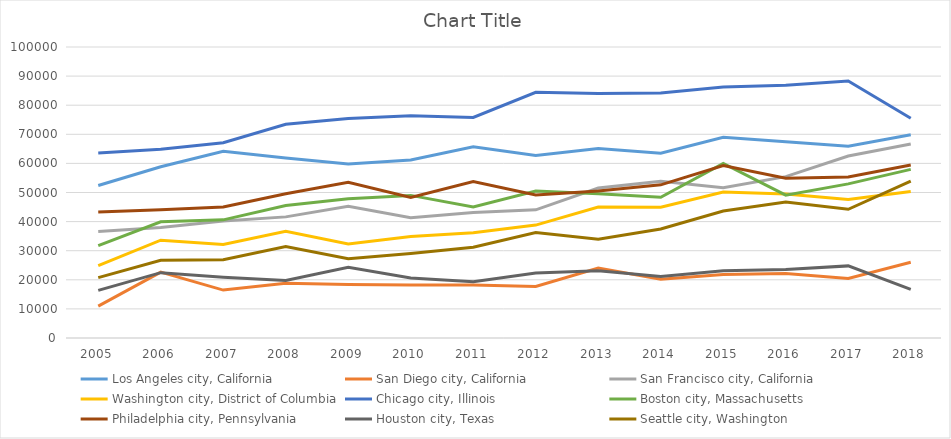
| Category | Los Angeles city, California | San Diego city, California | San Francisco city, California | Washington city, District of Columbia | Chicago city, Illinois | Boston city, Massachusetts | Philadelphia city, Pennsylvania | Houston city, Texas | Seattle city, Washington |
|---|---|---|---|---|---|---|---|---|---|
| 2005.0 | 52416 | 10938 | 36629 | 24905 | 63580 | 31769 | 43259 | 16357 | 20737 |
| 2006.0 | 58869 | 22632 | 37943 | 33625 | 64866 | 39913 | 44102 | 22455 | 26686 |
| 2007.0 | 64134 | 16465 | 40241 | 32163 | 67084 | 40598 | 45003 | 20901 | 26907 |
| 2008.0 | 61819 | 18821 | 41621 | 36636 | 73472 | 45522 | 49590 | 19762 | 31419 |
| 2009.0 | 59805 | 18364 | 45227 | 32328 | 75469 | 47840 | 53533 | 24318 | 27249 |
| 2010.0 | 61154 | 18178 | 41362 | 34895 | 76372 | 49007 | 48318 | 20641 | 29070 |
| 2011.0 | 65719 | 18171 | 43121 | 36200 | 75791 | 45031 | 53800 | 19335 | 31161 |
| 2012.0 | 62685 | 17737 | 44031 | 38795 | 84421 | 50485 | 49110 | 22369 | 36276 |
| 2013.0 | 65090 | 24069 | 51559 | 45003 | 84027 | 49558 | 50488 | 23097 | 33956 |
| 2014.0 | 63501 | 20233 | 53875 | 44965 | 84158 | 48357 | 52626 | 21099 | 37439 |
| 2015.0 | 68951 | 21858 | 51627 | 50165 | 86276 | 60012 | 59258 | 23090 | 43665 |
| 2016.0 | 67440 | 22136 | 55443 | 49514 | 86842 | 49069 | 54869 | 23550 | 46734 |
| 2017.0 | 65878 | 20479 | 62548 | 47625 | 88349 | 52972 | 55326 | 24784 | 44243 |
| 2018.0 | 69871 | 26021 | 66653 | 50327 | 75526 | 57938 | 59423 | 16706 | 53894 |